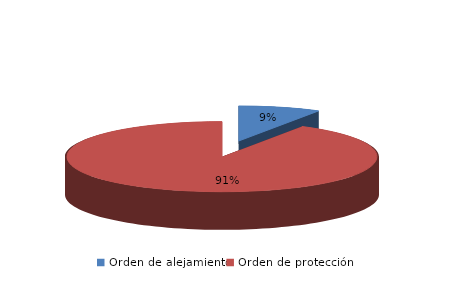
| Category | Series 0 |
|---|---|
| Orden de alejamiento | 29 |
| Orden de protección | 312 |